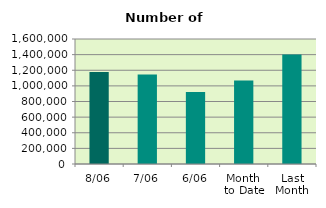
| Category | Series 0 |
|---|---|
| 8/06 | 1179170 |
| 7/06 | 1144684 |
| 6/06 | 921514 |
| Month 
to Date | 1068365.667 |
| Last
Month | 1401172.455 |